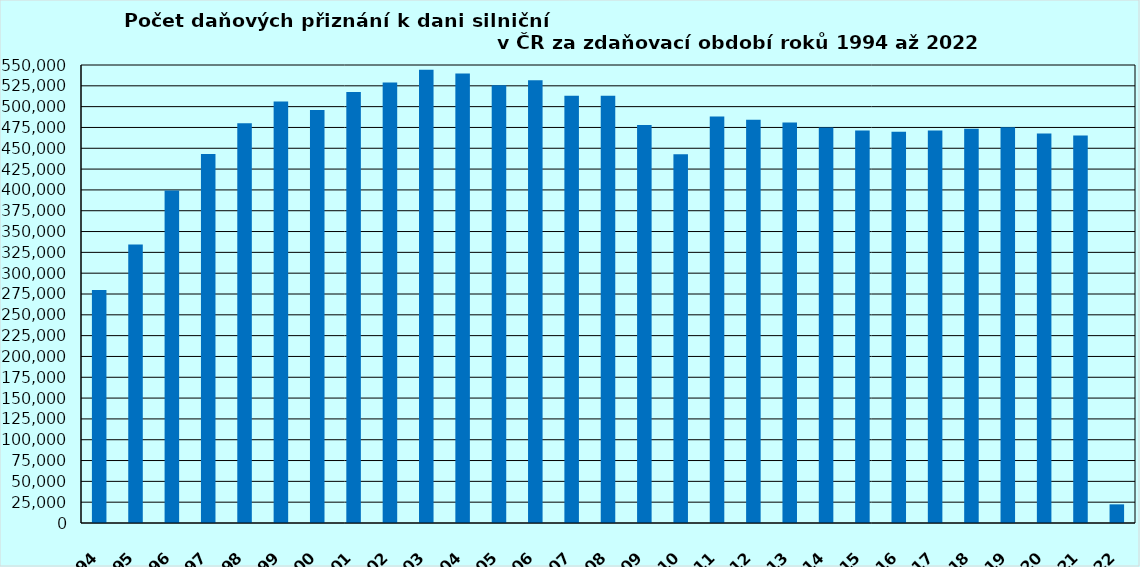
| Category | Series 1 |
|---|---|
| 1994.0 | 279797 |
| 1995.0 | 334460 |
| 1996.0 | 399157 |
| 1997.0 | 443229 |
| 1998.0 | 479914 |
| 1999.0 | 506279 |
| 2000.0 | 495820 |
| 2001.0 | 517428 |
| 2002.0 | 528848 |
| 2003.0 | 544269 |
| 2004.0 | 539786 |
| 2005.0 | 525648 |
| 2006.0 | 531697 |
| 2007.0 | 513087 |
| 2008.0 | 513064 |
| 2009.0 | 478026 |
| 2010.0 | 442865 |
| 2011.0 | 488065 |
| 2012.0 | 484223 |
| 2013.0 | 481005 |
| 2014.0 | 474856 |
| 2015.0 | 471310 |
| 2016.0 | 469748 |
| 2017.0 | 471289 |
| 2018.0 | 473309 |
| 2019.0 | 475362 |
| 2020.0 | 467652 |
| 2021.0 | 465311 |
| 2022.0 | 22404 |